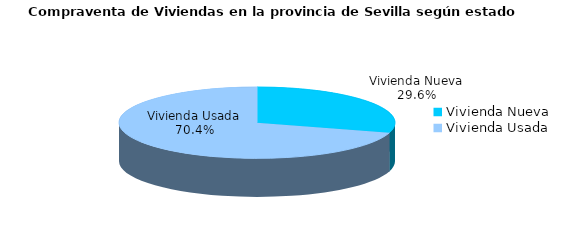
| Category | Series 0 | Series 1 |
|---|---|---|
| Vivienda Nueva | 286 | 0.296 |
| Vivienda Usada | 681 | 0.704 |